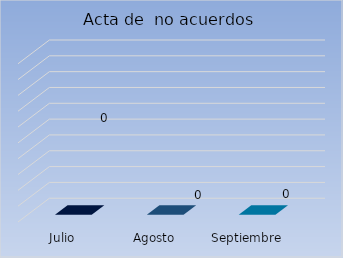
| Category | Acta de  no acuerdos |
|---|---|
| Julio | 0 |
| Agosto | 0 |
| Septiembre | 0 |